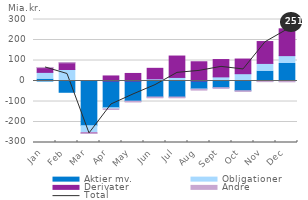
| Category | Aktier mv.  | Obligationer | Derivater | Andre |
|---|---|---|---|---|
| 2020-01-01 | 9.182 | 32.837 | 23.109 | 0.969 |
| 2020-02-01 | -54.992 | 56.127 | 32.612 | 0.343 |
| 2020-03-01 | -218.072 | -34.736 | -0.985 | -1.845 |
| 2020-04-01 | -130.28 | -6.183 | 24.63 | -2.496 |
| 2020-05-01 | -97.893 | -0.904 | 36.834 | -3.644 |
| 2020-06-01 | -78.067 | 10.782 | 51.078 | -3.905 |
| 2020-07-01 | -78.257 | 17.343 | 104.439 | -3.778 |
| 2020-08-01 | -38.103 | -2.198 | 93.802 | -4.183 |
| 2020-09-01 | -32.583 | 20.126 | 84.579 | -3.198 |
| 2020-10-01 | -47.476 | 35.679 | 71.437 | -3.228 |
| 2020-11-01 | 48.024 | 37.709 | 106.719 | -3.278 |
| 2020-12-01 | 85.427 | 38.348 | 130.815 | -4.103 |